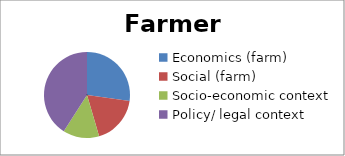
| Category | Farmers | Citizens | Total |
|---|---|---|---|
| Economics (farm) | 6 | 12 | 23 |
| Social (farm) | 4 | 19 | 40 |
| Socio-economic context | 3 | 17 | 31 |
| Policy/ legal context | 9 | 42 | 52 |